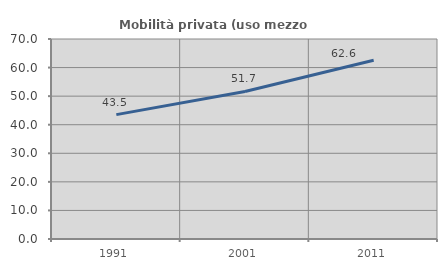
| Category | Mobilità privata (uso mezzo privato) |
|---|---|
| 1991.0 | 43.532 |
| 2001.0 | 51.652 |
| 2011.0 | 62.58 |